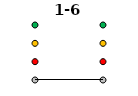
| Category | 0 | 1 | 2 | 3 | 1-6 |
|---|---|---|---|---|---|
| Time 1 | 0 | 1 | 2 | 3 | 0 |
| Time 2 | 0 | 1 | 2 | 3 | 0 |